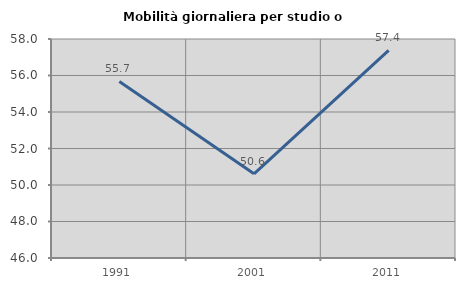
| Category | Mobilità giornaliera per studio o lavoro |
|---|---|
| 1991.0 | 55.677 |
| 2001.0 | 50.612 |
| 2011.0 | 57.375 |